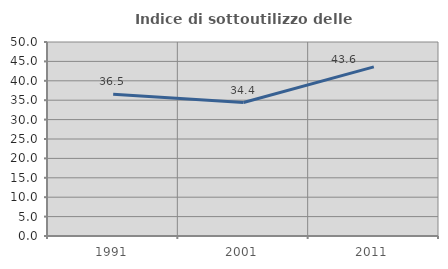
| Category | Indice di sottoutilizzo delle abitazioni  |
|---|---|
| 1991.0 | 36.522 |
| 2001.0 | 34.405 |
| 2011.0 | 43.581 |